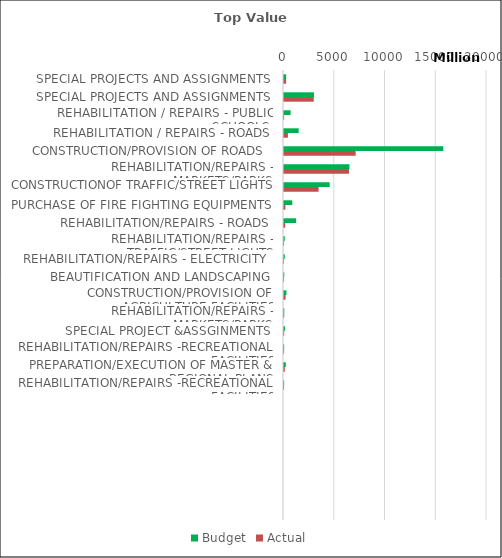
| Category | Budget | Actual |
|---|---|---|
| SPECIAL PROJECTS AND ASSIGNMENTS | 214000000 | 210040958.08 |
| SPECIAL PROJECTS AND ASSIGNMENTS | 2955000000 | 2929025295.6 |
| REHABILITATION / REPAIRS - PUBLIC SCHOOLS  | 650000000 | 14301327.8 |
| REHABILITATION / REPAIRS - ROADS | 1446316631 | 386519615.04 |
| CONSTRUCTION/PROVISION OF ROADS  | 15699815000 | 7058653418.26 |
| REHABILITATION/REPAIRS - MARKETS/PARKS | 6450000000 | 6403788720 |
| CONSTRUCTIONOF TRAFFIC/STREET LIGHTS  | 4500000000 | 3408497560.97 |
| PURCHASE OF FIRE FIGHTING EQUIPMENTS  | 820000000 | 136229000 |
| REHABILITATION/REPAIRS - ROADS | 1200000000 | 116876465.25 |
| REHABILITATION/REPAIRS - TRAFFIC/STREET LIGHTS | 75000000 | 8435507.43 |
| REHABILITATION/REPAIRS - ELECTRICITY  | 75000000 | 2110944.25 |
| BEAUTIFICATION AND LANDSCAPING | 30000000 | 6982755 |
| CONSTRUCTION/PROVISION OF AGRICULTURE FACILITIES | 246000000 | 153480960.31 |
| REHABILITATION/REPAIRS - MARKETS/PARKS | 29000000 | 20769838.27 |
| SPECIAL PROJECT &ASSGINMENTS | 90000000 | 17085277.04 |
| REHABILITATION/REPAIRS -RECREATIONAL FACILITIES | 18000000 | 9500873.5 |
| PREPARATION/EXECUTION OF MASTER & REGIONAL PLANS | 180300000 | 83571725 |
| REHABILITATION/REPAIRS -RECREATIONAL FACILITIES | 18000000 | 9500873.5 |